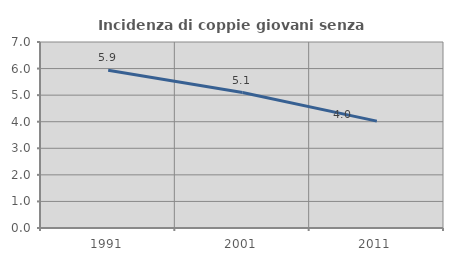
| Category | Incidenza di coppie giovani senza figli |
|---|---|
| 1991.0 | 5.935 |
| 2001.0 | 5.097 |
| 2011.0 | 4.022 |